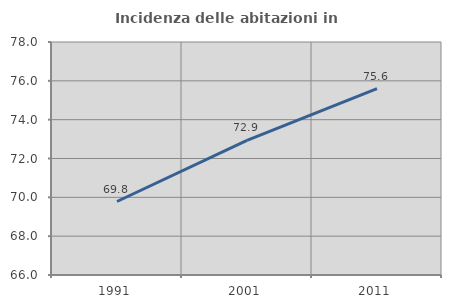
| Category | Incidenza delle abitazioni in proprietà  |
|---|---|
| 1991.0 | 69.785 |
| 2001.0 | 72.935 |
| 2011.0 | 75.602 |